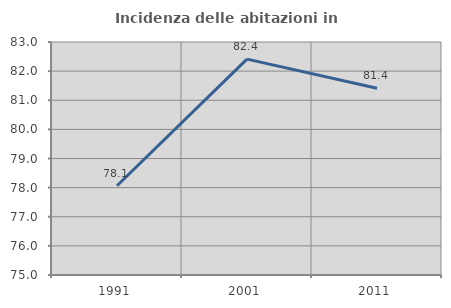
| Category | Incidenza delle abitazioni in proprietà  |
|---|---|
| 1991.0 | 78.065 |
| 2001.0 | 82.412 |
| 2011.0 | 81.415 |